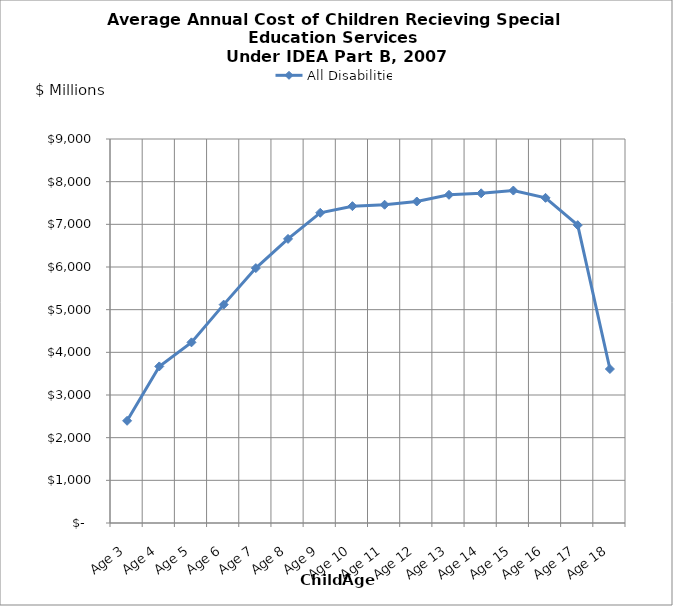
| Category | All Disabilities |
|---|---|
| Age 3 | 2395.084 |
| Age 4 | 3669.562 |
| Age 5 | 4233.928 |
| Age 6 | 5118.375 |
| Age 7 | 5974.04 |
| Age 8 | 6658.448 |
| Age 9 | 7270.422 |
| Age 10 | 7426.002 |
| Age 11 | 7459.531 |
| Age 12 | 7535.066 |
| Age 13 | 7692.009 |
| Age 14 | 7726.964 |
| Age 15 | 7791.54 |
| Age 16 | 7621.098 |
| Age 17 | 6981.106 |
| Age 18 | 3609.281 |